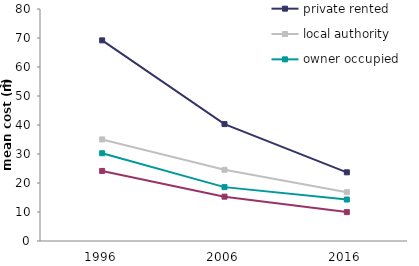
| Category | private rented | local authority | owner occupied | housing association |
|---|---|---|---|---|
| 1996.0 | 69.185 | 35.027 | 30.255 | 24.161 |
| 2006.0 | 40.311 | 24.553 | 18.579 | 15.292 |
| 2016.0 | 23.682 | 16.839 | 14.301 | 9.964 |